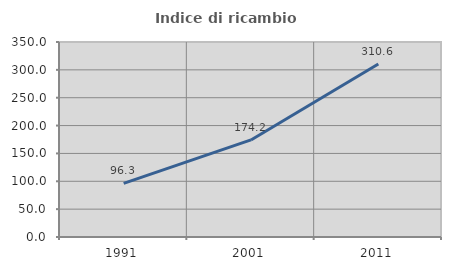
| Category | Indice di ricambio occupazionale  |
|---|---|
| 1991.0 | 96.296 |
| 2001.0 | 174.242 |
| 2011.0 | 310.606 |